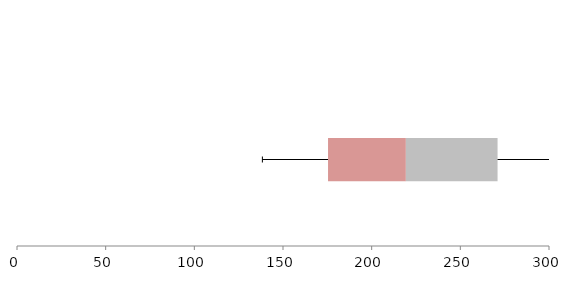
| Category | Series 1 | Series 2 | Series 3 |
|---|---|---|---|
| 0 | 175.396 | 43.891 | 51.708 |